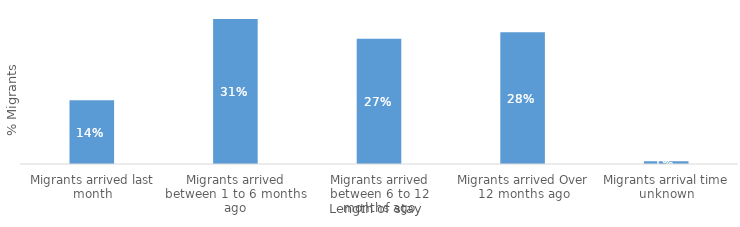
| Category | Series 0 |
|---|---|
| Migrants arrived last month | 0.136 |
| Migrants arrived between 1 to 6 months ago | 0.31 |
| Migrants arrived between 6 to 12 months ago | 0.267 |
| Migrants arrived Over 12 months ago | 0.281 |
| Migrants arrival time unknown | 0.006 |